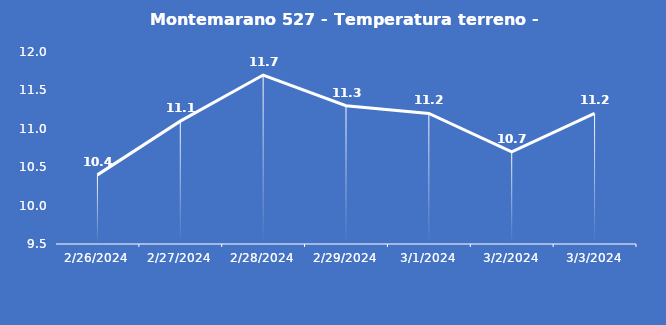
| Category | Montemarano 527 - Temperatura terreno - Grezzo (°C) |
|---|---|
| 2/26/24 | 10.4 |
| 2/27/24 | 11.1 |
| 2/28/24 | 11.7 |
| 2/29/24 | 11.3 |
| 3/1/24 | 11.2 |
| 3/2/24 | 10.7 |
| 3/3/24 | 11.2 |